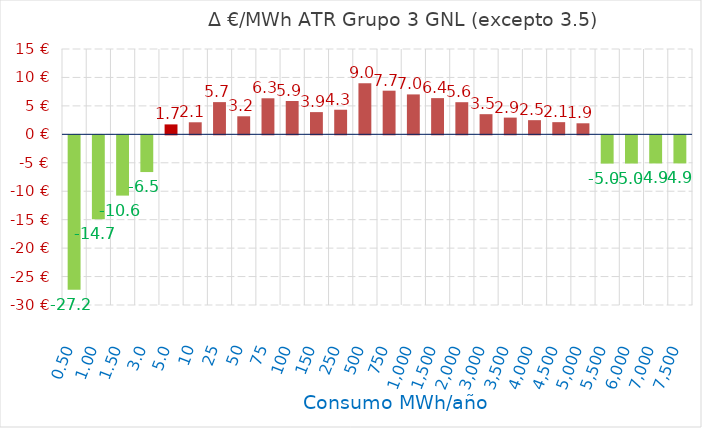
| Category | D €/MWh |
|---|---|
| 0.5 | -27.162 |
| 1.0 | -14.737 |
| 1.5 | -10.596 |
| 3.0 | -6.454 |
| 5.0 | 1.746 |
| 10.0 | 2.118 |
| 25.0 | 5.663 |
| 50.0 | 3.173 |
| 75.0 | 6.336 |
| 100.0 | 5.856 |
| 150.0 | 3.905 |
| 250.0 | 4.323 |
| 500.0 | 8.979 |
| 750.0 | 7.671 |
| 1000.0 | 7.017 |
| 1500.0 | 6.363 |
| 2000.0 | 5.647 |
| 3000.0 | 3.543 |
| 3500.0 | 2.941 |
| 4000.0 | 2.49 |
| 4500.0 | 2.139 |
| 5000.0 | 1.942 |
| 5500.0 | -4.969 |
| 6000.0 | -4.958 |
| 7000.0 | -4.941 |
| 7500.0 | -4.935 |